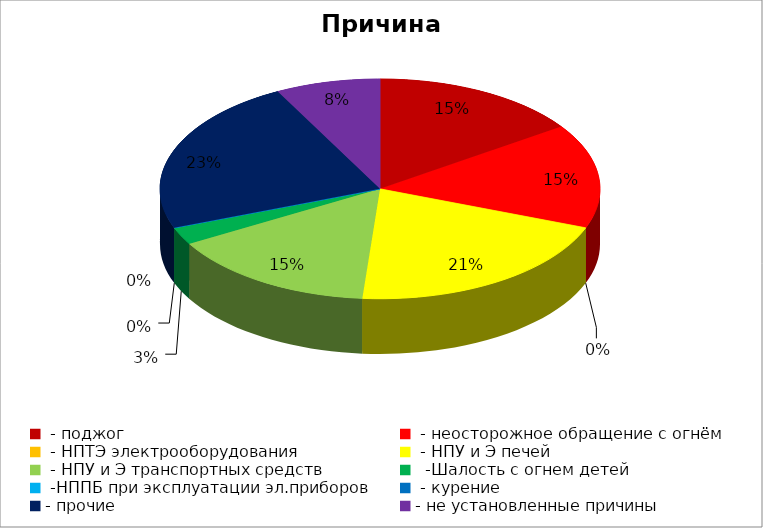
| Category | Причина пожара |
|---|---|
|  - поджог | 6 |
|  - неосторожное обращение с огнём | 6 |
|  - НПТЭ электрооборудования | 0 |
|  - НПУ и Э печей | 8 |
|  - НПУ и Э транспортных средств | 6 |
|   -Шалость с огнем детей | 1 |
|  -НППБ при эксплуатации эл.приборов | 0 |
|  - курение | 0 |
| - прочие | 9 |
| - не установленные причины | 3 |